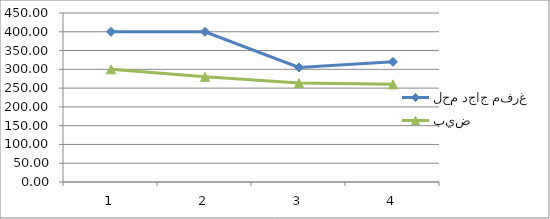
| Category | لحم دجاج مفرغ | بيض |
|---|---|---|
| 0 | 400 | 300 |
| 1 | 400 | 280 |
| 2 | 305 | 263.33 |
| 3 | 320 | 260 |